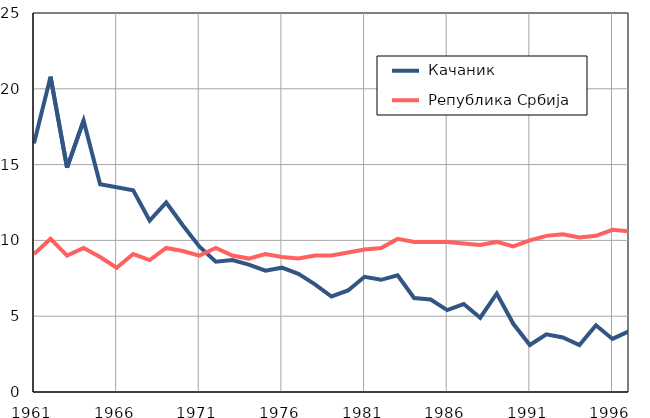
| Category |  Качаник |  Република Србија |
|---|---|---|
| 1961.0 | 16.4 | 9.1 |
| 1962.0 | 20.8 | 10.1 |
| 1963.0 | 14.8 | 9 |
| 1964.0 | 17.9 | 9.5 |
| 1965.0 | 13.7 | 8.9 |
| 1966.0 | 13.5 | 8.2 |
| 1967.0 | 13.3 | 9.1 |
| 1968.0 | 11.3 | 8.7 |
| 1969.0 | 12.5 | 9.5 |
| 1970.0 | 11 | 9.3 |
| 1971.0 | 9.6 | 9 |
| 1972.0 | 8.6 | 9.5 |
| 1973.0 | 8.7 | 9 |
| 1974.0 | 8.4 | 8.8 |
| 1975.0 | 8 | 9.1 |
| 1976.0 | 8.2 | 8.9 |
| 1977.0 | 7.8 | 8.8 |
| 1978.0 | 7.1 | 9 |
| 1979.0 | 6.3 | 9 |
| 1980.0 | 6.7 | 9.2 |
| 1981.0 | 7.6 | 9.4 |
| 1982.0 | 7.4 | 9.5 |
| 1983.0 | 7.7 | 10.1 |
| 1984.0 | 6.2 | 9.9 |
| 1985.0 | 6.1 | 9.9 |
| 1986.0 | 5.4 | 9.9 |
| 1987.0 | 5.8 | 9.8 |
| 1988.0 | 4.9 | 9.7 |
| 1989.0 | 6.5 | 9.9 |
| 1990.0 | 4.5 | 9.6 |
| 1991.0 | 3.1 | 10 |
| 1992.0 | 3.8 | 10.3 |
| 1993.0 | 3.6 | 10.4 |
| 1994.0 | 3.1 | 10.2 |
| 1995.0 | 4.4 | 10.3 |
| 1996.0 | 3.5 | 10.7 |
| 1997.0 | 4 | 10.6 |